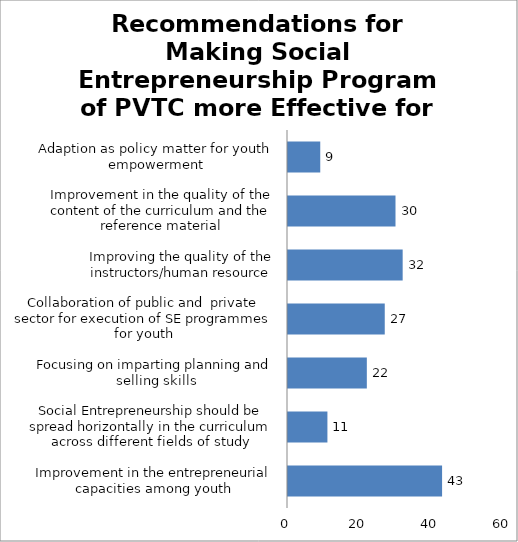
| Category | Series 0 |
|---|---|
| Improvement in the entrepreneurial capacities among youth | 43 |
| Social Entrepreneurship should be spread horizontally in the curriculum across different fields of study | 11 |
| Focusing on imparting planning and selling skills | 22 |
| Collaboration of public and  private sector for execution of SE programmes for youth | 27 |
| Improving the quality of the instructors/human resource | 32 |
| Improvement in the quality of the content of the curriculum and the reference material | 30 |
| Adaption as policy matter for youth empowerment | 9 |